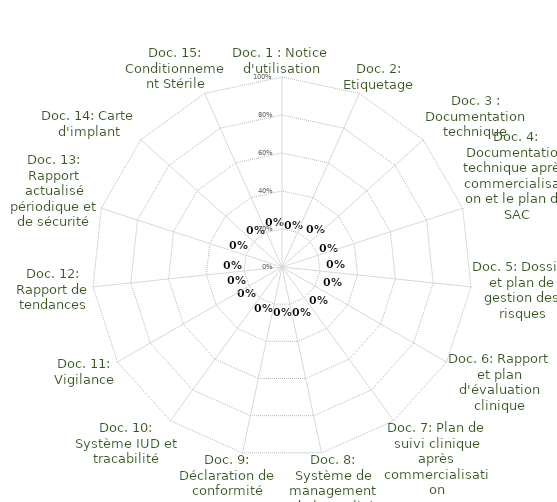
| Category | Maitrise documentaire |
|---|---|
| Doc. 1 : Notice d'utilisation | 0 |
| Doc. 2: Etiquetage | 0 |
| Doc. 3 : Documentation technique | 0 |
| Doc. 4: Documentation technique après commercialisation et le plan de SAC | 0 |
| Doc. 5: Dossier et plan de gestion des risques | 0 |
| Doc. 6: Rapport et plan d'évaluation clinique | 0 |
| Doc. 7: Plan de suivi clinique après commercialisation | 0 |
| Doc. 8: Système de management de la qualité | 0 |
| Doc. 9: Déclaration de conformité | 0 |
| Doc. 10: Système IUD et tracabilité | 0 |
| Doc. 11: Vigilance | 0 |
| Doc. 12: Rapport de tendances | 0 |
| Doc. 13: Rapport actualisé périodique et de sécurité | 0 |
| Doc. 14: Carte d'implant | 0 |
| Doc. 15: Conditionnement Stérile | 0 |